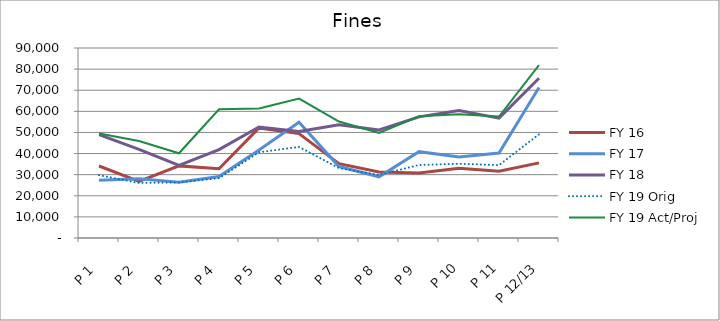
| Category | FY 16 | FY 17 | FY 18 | FY 19 Orig | FY 19 Act/Proj |
|---|---|---|---|---|---|
| P 1 | 34100.35 | 27317.52 | 48978.99 | 29761.776 | 49527.93 |
| P 2 | 26788.26 | 28016.48 | 41939.52 | 26084.447 | 45928.85 |
| P 3 | 34157.5 | 26458.11 | 34345.68 | 26321.524 | 40128.29 |
| P 4 | 32831.03 | 29084.41 | 41876.64 | 28324.607 | 60933.26 |
| P 5 | 52156.26 | 41672.43 | 52590.38 | 40601.153 | 61328.92 |
| P 6 | 49461.12 | 54827.29 | 50415.97 | 43166.292 | 66031.93 |
| P 7 | 35235.79 | 33841.1 | 53651.05 | 33085.038 | 55160.949 |
| P 8 | 31297.62 | 29006.73 | 51213.46 | 29854.01 | 49774.027 |
| P 9 | 30772 | 40905.16 | 57380.56 | 34567.663 | 57632.853 |
| P 10 | 33023.18 | 38349.85 | 60329.95 | 35176.361 | 58647.704 |
| P 11 | 31590.51 | 40280.25 | 56790.95 | 34515.443 | 57545.789 |
| P 12/13 | 35583 | 71302.68 | 75690.88 | 49141.687 | 81931.359 |